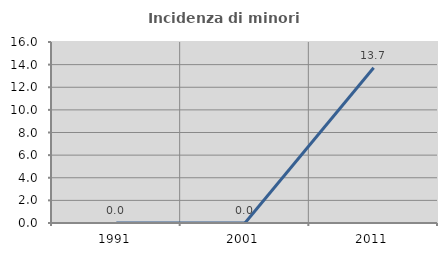
| Category | Incidenza di minori stranieri |
|---|---|
| 1991.0 | 0 |
| 2001.0 | 0 |
| 2011.0 | 13.725 |